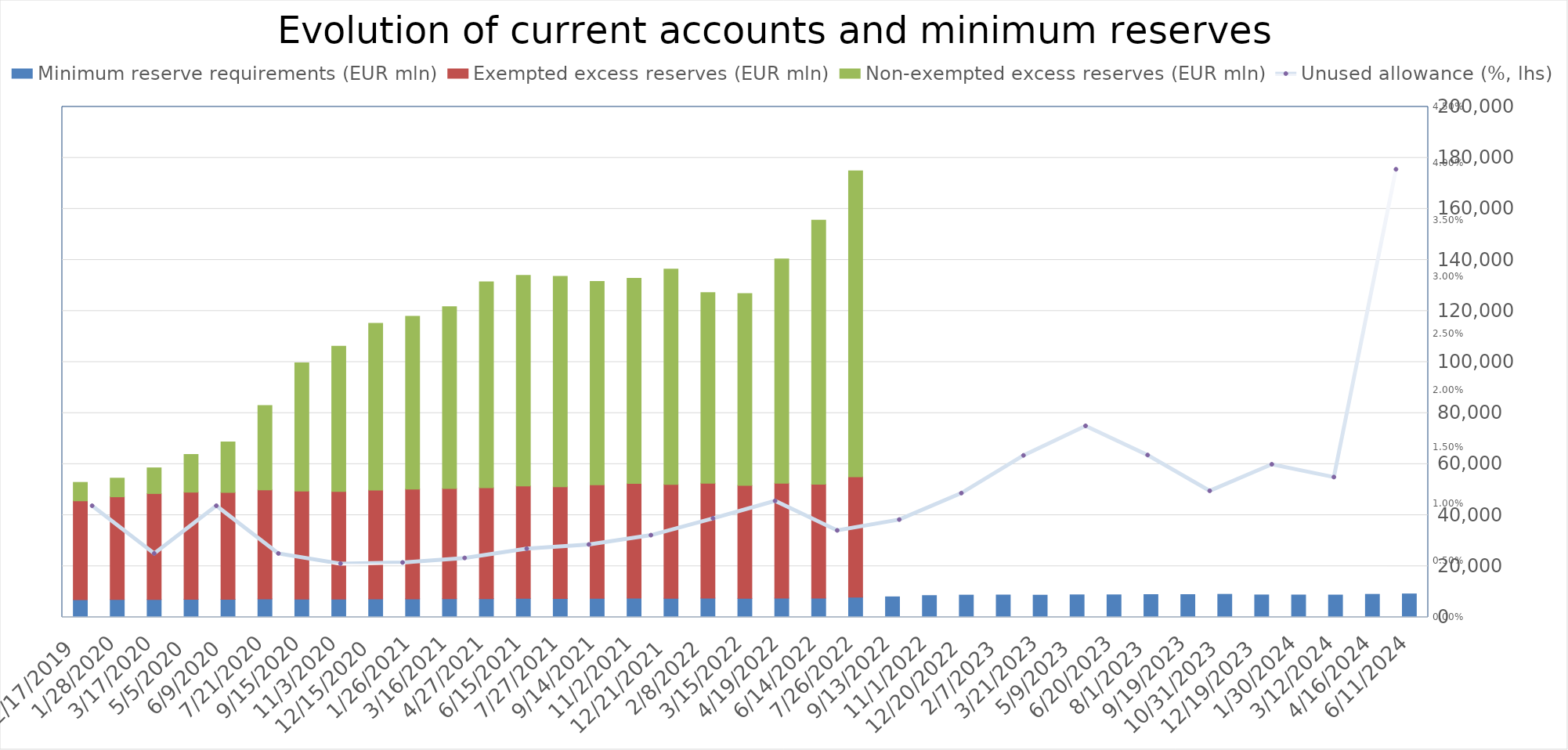
| Category | Minimum reserve requirements (EUR mln) | Exempted excess reserves (EUR mln) | Non-exempted excess reserves (EUR mln) |
|---|---|---|---|
| 6/11/24 | 9161 | 0 | 0 |
| 4/16/24 | 8997 | 0 | 0 |
| 3/12/24 | 8722 | 0 | 0 |
| 1/30/24 | 8741.019 | 0 | 0 |
| 12/19/23 | 8762 | 0 | 0 |
| 10/31/23 | 9001 | 0 | 0 |
| 9/19/23 | 8896 | 0 | 0 |
| 8/1/23 | 8904 | 0 | 0 |
| 6/20/23 | 8799 | 0 | 0 |
| 5/9/23 | 8796 | 0 | 0 |
| 3/21/23 | 8668 | 0 | 0 |
| 2/7/23 | 8736 | 0 | 0 |
| 12/20/22 | 8689 | 0 | 0 |
| 11/1/22 | 8517 | 0 | 0 |
| 9/13/22 | 8018 | 0 | 0 |
| 7/26/22 | 7929 | 47109 | 119909 |
| 6/14/22 | 7495 | 44621 | 103454 |
| 4/19/22 | 7536 | 44962 | 87885 |
| 3/15/22 | 7409 | 44244 | 75192 |
| 2/8/22 | 7536 | 44997 | 74696 |
| 12/21/21 | 7472 | 44599 | 84381 |
| 11/2/21 | 7531 | 44914 | 80355 |
| 9/14/21 | 7460 | 44471 | 79647 |
| 7/27/21 | 7352 | 43793 | 82435 |
| 6/15/21 | 7404 | 44036 | 82520 |
| 4/27/21 | 7313 | 43430 | 80697 |
| 3/16/21 | 7254 | 43192 | 71224 |
| 1/26/21 | 7225 | 42978 | 67723 |
| 12/15/20 | 7190 | 42671 | 65344 |
| 11/3/20 | 7128 | 42161 | 56951 |
| 9/15/20 | 7165 | 42265 | 50289 |
| 7/21/20 | 7217 | 42685 | 33099 |
| 6/9/20 | 7060 | 41891 | 19741 |
| 5/5/20 | 7085 | 41937 | 14783 |
| 3/17/20 | 7002 | 41491 | 10061 |
| 1/28/20 | 6981 | 40234 | 7303 |
| 12/17/19 | 6887 | 38752 | 7220 |